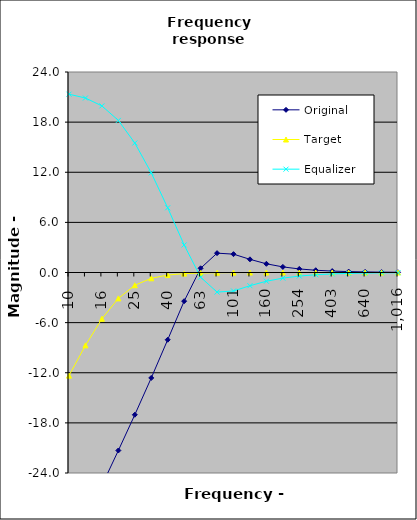
| Category | Original | Target | Equalizer |
|---|---|---|---|
| 10.0 | -33.688 | -12.346 | 21.342 |
| 12.599210498948732 | -29.607 | -8.723 | 20.884 |
| 15.874010519681995 | -25.487 | -5.544 | 19.942 |
| 20.0 | -21.306 | -3.098 | 18.208 |
| 25.198420997897465 | -17.031 | -1.531 | 15.5 |
| 31.74802103936399 | -12.621 | -0.696 | 11.926 |
| 40.0 | -8.049 | -0.305 | 7.744 |
| 50.39684199579493 | -3.431 | -0.134 | 3.297 |
| 63.49604207872798 | 0.504 | -0.06 | -0.564 |
| 80.0 | 2.316 | -0.028 | -2.344 |
| 100.79368399158986 | 2.197 | -0.014 | -2.211 |
| 126.99208415745596 | 1.576 | -0.007 | -1.583 |
| 160.0 | 1.042 | -0.004 | -1.045 |
| 201.58736798317972 | 0.67 | -0.002 | -0.672 |
| 253.98416831491193 | 0.426 | -0.001 | -0.427 |
| 320.0 | 0.27 | -0.001 | -0.27 |
| 403.17473596635944 | 0.17 | 0 | -0.171 |
| 507.96833662982385 | 0.107 | 0 | -0.108 |
| 640.0 | 0.068 | 0 | -0.068 |
| 806.3494719327189 | 0.043 | 0 | -0.043 |
| 1015.9366732596477 | 0.027 | 0 | -0.027 |